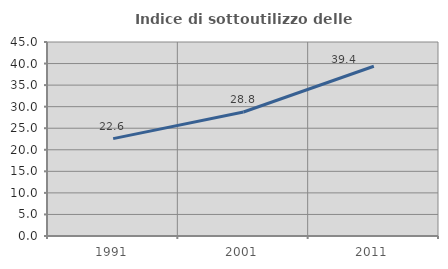
| Category | Indice di sottoutilizzo delle abitazioni  |
|---|---|
| 1991.0 | 22.59 |
| 2001.0 | 28.755 |
| 2011.0 | 39.373 |